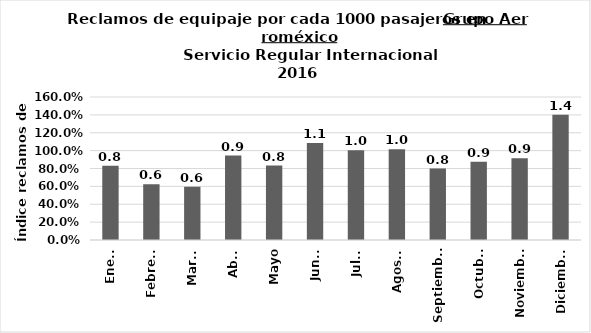
| Category | Reclamos por cada 1000 pasajeros |
|---|---|
| Enero | 0.83 |
| Febrero | 0.623 |
| Marzo | 0.596 |
| Abril | 0.944 |
| Mayo | 0.833 |
| Junio | 1.085 |
| Julio | 1.003 |
| Agosto | 1.015 |
| Septiembre | 0.799 |
| Octubre | 0.875 |
| Noviembre | 0.914 |
| Diciembre | 1.402 |